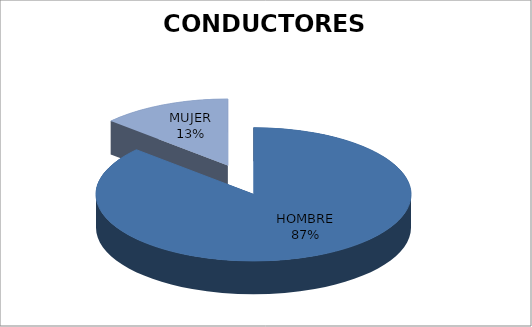
| Category | E.E. |
|---|---|
| HOMBRE | 26 |
| MUJER | 4 |